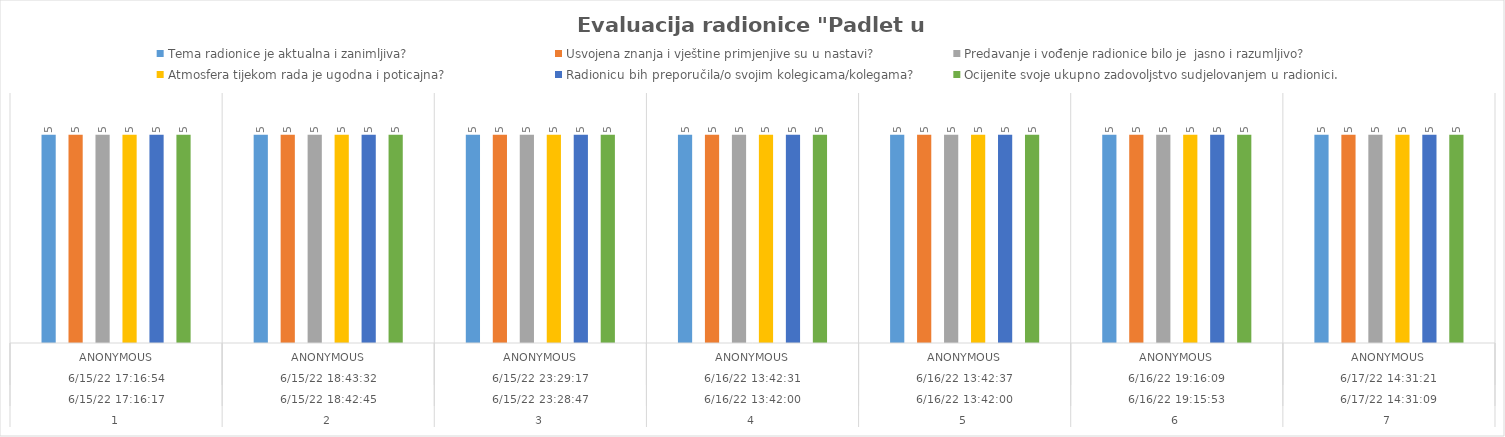
| Category | Tema radionice je aktualna i zanimljiva? | Usvojena znanja i vještine primjenjive su u nastavi? | Predavanje i vođenje radionice bilo je  jasno i razumljivo? | Atmosfera tijekom rada je ugodna i poticajna? | Radionicu bih preporučila/o svojim kolegicama/kolegama? | Ocijenite svoje ukupno zadovoljstvo sudjelovanjem u radionici. |
|---|---|---|---|---|---|---|
| 0 | 5 | 5 | 5 | 5 | 5 | 5 |
| 1 | 5 | 5 | 5 | 5 | 5 | 5 |
| 2 | 5 | 5 | 5 | 5 | 5 | 5 |
| 3 | 5 | 5 | 5 | 5 | 5 | 5 |
| 4 | 5 | 5 | 5 | 5 | 5 | 5 |
| 5 | 5 | 5 | 5 | 5 | 5 | 5 |
| 6 | 5 | 5 | 5 | 5 | 5 | 5 |